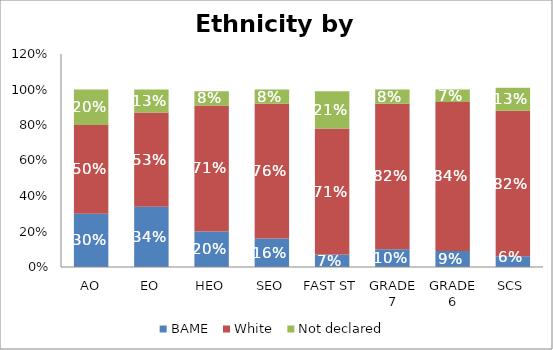
| Category | BAME | White | Not declared |
|---|---|---|---|
| AO | 0.3 | 0.5 | 0.2 |
| EO | 0.34 | 0.53 | 0.13 |
| HEO | 0.2 | 0.71 | 0.08 |
| SEO | 0.16 | 0.76 | 0.08 |
| FAST ST | 0.07 | 0.71 | 0.21 |
| GRADE 7 | 0.1 | 0.82 | 0.08 |
| GRADE 6 | 0.09 | 0.84 | 0.07 |
| SCS | 0.06 | 0.82 | 0.13 |